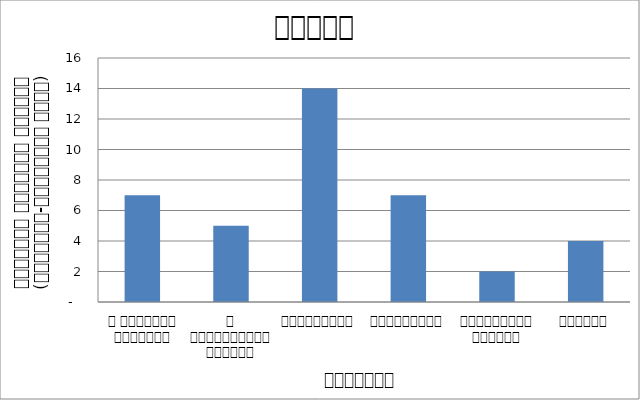
| Category | न्याय |
|---|---|
| द हिमालयन टाइम्स् | 7 |
| द काठमाण्डौं पोस्ट् | 5 |
| रिपब्लिका | 14 |
| कान्तिपुर | 7 |
| अन्नपूर्ण पोस्ट् | 2 |
| नागरिक | 4 |